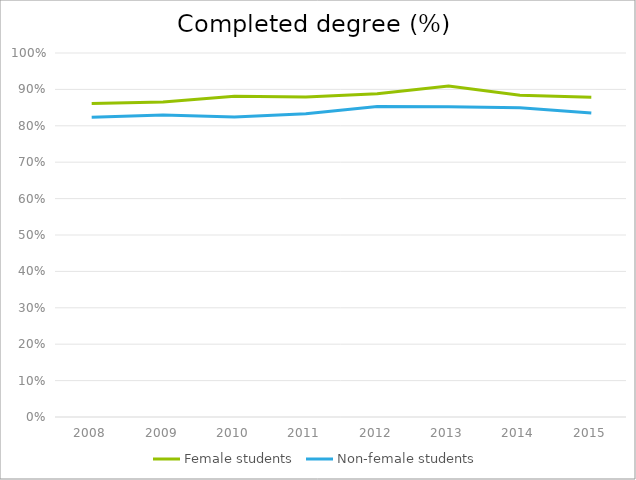
| Category | Female students | Non-female students |
|---|---|---|
| 2008.0 | 0.861 | 0.823 |
| 2009.0 | 0.865 | 0.829 |
| 2010.0 | 0.881 | 0.824 |
| 2011.0 | 0.879 | 0.833 |
| 2012.0 | 0.888 | 0.853 |
| 2013.0 | 0.909 | 0.853 |
| 2014.0 | 0.884 | 0.85 |
| 2015.0 | 0.879 | 0.835 |